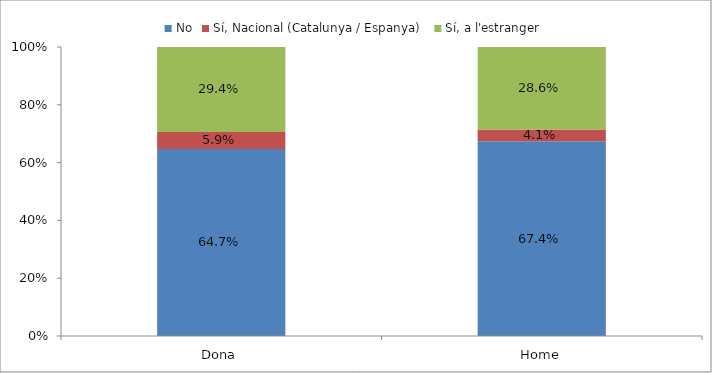
| Category | No | Sí, Nacional (Catalunya / Espanya) | Sí, a l'estranger |
|---|---|---|---|
| Dona | 0.647 | 0.059 | 0.294 |
| Home | 0.674 | 0.041 | 0.286 |